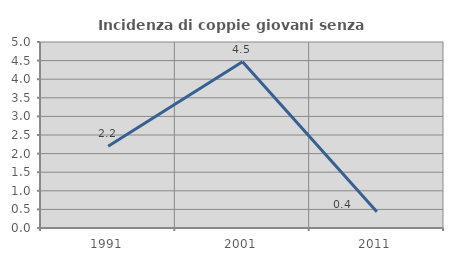
| Category | Incidenza di coppie giovani senza figli |
|---|---|
| 1991.0 | 2.198 |
| 2001.0 | 4.472 |
| 2011.0 | 0.439 |